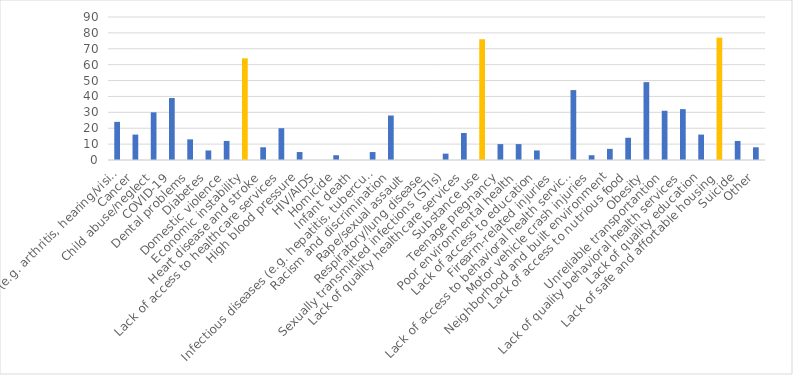
| Category | Number of Responses |
|---|---|
| Aging problems (e.g. arthritis, hearing/vision loss, etc.) | 24 |
| Cancer | 16 |
| Child abuse/neglect | 30 |
| COVID-19 | 39 |
| Dental problems | 13 |
| Diabetes | 6 |
| Domestic violence | 12 |
| Economic instability | 64 |
| Heart disease and stroke | 8 |
| Lack of access to healthcare services | 20 |
| High blood pressure | 5 |
| HIV/AIDS | 0 |
| Homicide | 3 |
| Infant death | 0 |
| Infectious diseases (e.g. hepatitis, tuberculosis, etc.) | 5 |
| Racism and discrimination | 28 |
| Rape/sexual assault | 0 |
| Respiratory/lung disease | 0 |
| Sexually transmitted infections (STIs) | 4 |
| Lack of quality healthcare services | 17 |
| Substance use | 76 |
| Teenage pregnancy | 10 |
| Poor environmental health | 10 |
| Lack of access to education | 6 |
| Firearm-related injuries | 0 |
| Lack of access to behavioral health services | 44 |
| Motor vehicle crash injuries | 3 |
| Neighborhood and built environment | 7 |
| Lack of access to nutrious food | 14 |
| Obesity | 49 |
| Unreliable transportantion | 31 |
| Lack of quality behavioral health services | 32 |
| Lack of quality education | 16 |
| Lack of safe and affortable housing | 77 |
| Suicide | 12 |
| Other | 8 |